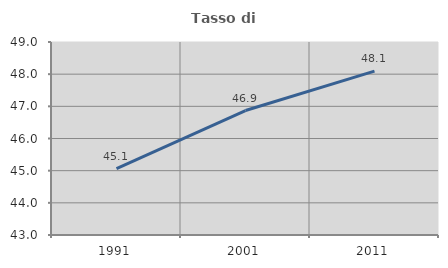
| Category | Tasso di occupazione   |
|---|---|
| 1991.0 | 45.065 |
| 2001.0 | 46.87 |
| 2011.0 | 48.096 |